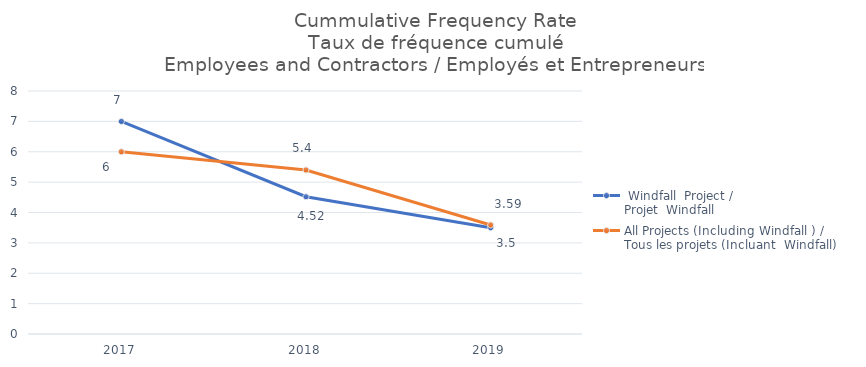
| Category |  Windfall  Project / 
Projet  Windfall | All Projects (Including Windfall ) / 
Tous les projets (Incluant  Windfall) |
|---|---|---|
| 2017 | 7 | 6 |
| 2018 | 4.52 | 5.4 |
| 2019 | 3.5 | 3.59 |